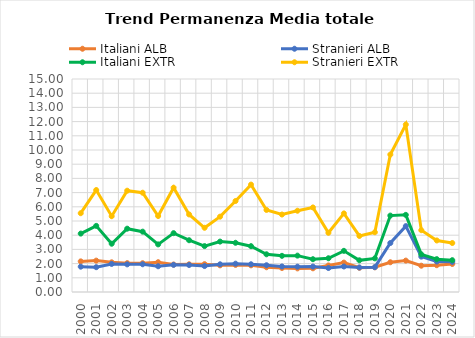
| Category | Italiani ALB | Stranieri ALB | Italiani EXTR | Stranieri EXTR |
|---|---|---|---|---|
| 2000.0 | 2.156 | 1.785 | 4.114 | 5.549 |
| 2001.0 | 2.21 | 1.747 | 4.657 | 7.179 |
| 2002.0 | 2.09 | 1.977 | 3.4 | 5.338 |
| 2003.0 | 2.032 | 1.946 | 4.458 | 7.134 |
| 2004.0 | 2.028 | 1.953 | 4.249 | 6.992 |
| 2005.0 | 2.097 | 1.812 | 3.353 | 5.351 |
| 2006.0 | 1.934 | 1.912 | 4.144 | 7.346 |
| 2007.0 | 1.952 | 1.9 | 3.645 | 5.463 |
| 2008.0 | 1.96 | 1.828 | 3.233 | 4.522 |
| 2009.0 | 1.877 | 1.951 | 3.549 | 5.306 |
| 2010.0 | 1.907 | 1.994 | 3.466 | 6.409 |
| 2011.0 | 1.877 | 1.952 | 3.228 | 7.563 |
| 2012.0 | 1.743 | 1.886 | 2.656 | 5.78 |
| 2013.0 | 1.691 | 1.797 | 2.547 | 5.457 |
| 2014.0 | 1.662 | 1.783 | 2.561 | 5.723 |
| 2015.0 | 1.669 | 1.789 | 2.309 | 5.954 |
| 2016.0 | 1.868 | 1.689 | 2.376 | 4.169 |
| 2017.0 | 2.071 | 1.797 | 2.898 | 5.534 |
| 2018.0 | 1.707 | 1.728 | 2.231 | 3.947 |
| 2019.0 | 1.741 | 1.749 | 2.368 | 4.209 |
| 2020.0 | 2.094 | 3.449 | 5.381 | 9.681 |
| 2021.0 | 2.211 | 4.639 | 5.432 | 11.793 |
| 2022.0 | 1.852 | 2.491 | 2.651 | 4.352 |
| 2023.0 | 1.887 | 2.145 | 2.314 | 3.63 |
| 2024.0 | 1.975 | 2.123 | 2.24 | 3.45 |